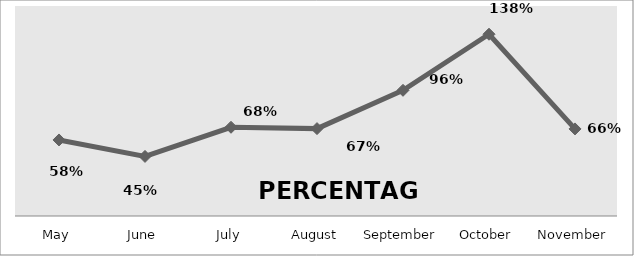
| Category | PERCENTAGE |
|---|---|
| May | 0.579 |
| June | 0.454 |
| July | 0.676 |
| August | 0.666 |
| September | 0.958 |
| October | 1.385 |
| November | 0.663 |